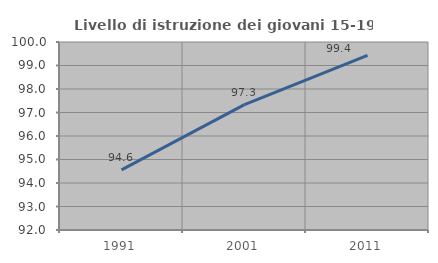
| Category | Livello di istruzione dei giovani 15-19 anni |
|---|---|
| 1991.0 | 94.56 |
| 2001.0 | 97.333 |
| 2011.0 | 99.429 |